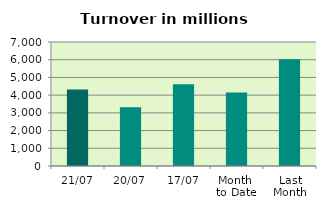
| Category | Series 0 |
|---|---|
| 21/07 | 4322.588 |
| 20/07 | 3312.776 |
| 17/07 | 4609.185 |
| Month 
to Date | 4149.455 |
| Last
Month | 6026.772 |